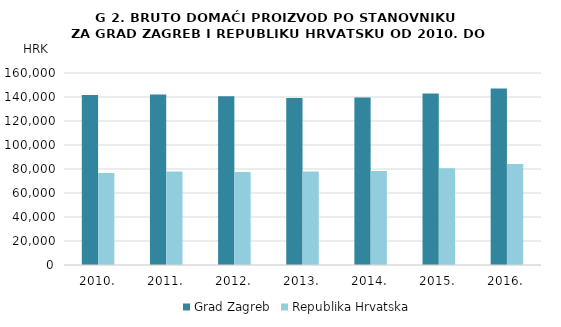
| Category | Grad Zagreb | Republika Hrvatska |
|---|---|---|
| 2010. | 141683 | 76610 |
| 2011. | 142119 | 77857 |
| 2012. | 140592 | 77494 |
| 2013. | 139260 | 77985 |
| 2014. | 139655 | 78273 |
| 2015. | 142824 | 80707 |
| 2016. | 147166 | 84207 |